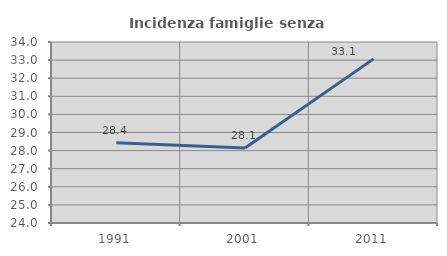
| Category | Incidenza famiglie senza nuclei |
|---|---|
| 1991.0 | 28.43 |
| 2001.0 | 28.138 |
| 2011.0 | 33.068 |